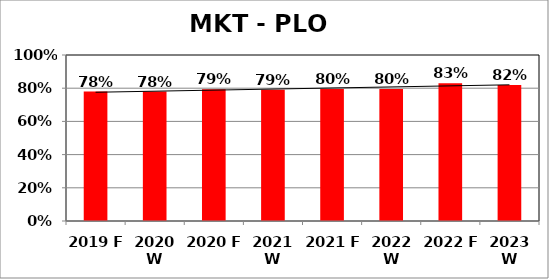
| Category | Series 0 |
|---|---|
| 2019 F | 0.78 |
| 2020 W | 0.78 |
| 2020 F | 0.794 |
| 2021 W | 0.79 |
| 2021 F | 0.795 |
| 2022 W | 0.795 |
| 2022 F | 0.83 |
| 2023 W | 0.82 |